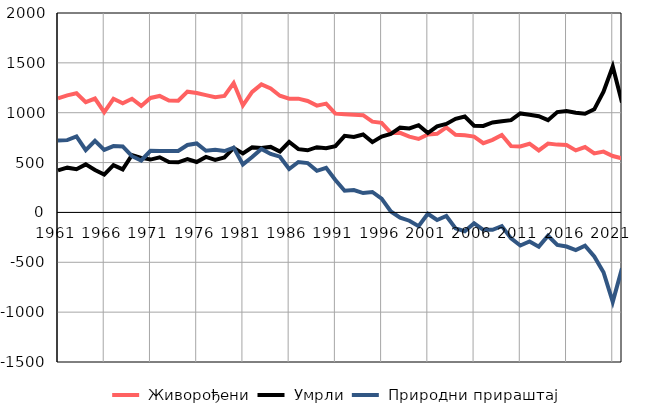
| Category |  Живорођени |  Умрли |  Природни прираштај |
|---|---|---|---|
| 1961.0 | 1144 | 422 | 722 |
| 1962.0 | 1174 | 449 | 725 |
| 1963.0 | 1195 | 433 | 762 |
| 1964.0 | 1106 | 482 | 624 |
| 1965.0 | 1142 | 425 | 717 |
| 1966.0 | 1006 | 379 | 627 |
| 1967.0 | 1140 | 475 | 665 |
| 1968.0 | 1094 | 432 | 662 |
| 1969.0 | 1140 | 576 | 564 |
| 1970.0 | 1068 | 547 | 521 |
| 1971.0 | 1148 | 530 | 618 |
| 1972.0 | 1168 | 553 | 615 |
| 1973.0 | 1122 | 506 | 616 |
| 1974.0 | 1120 | 503 | 617 |
| 1975.0 | 1211 | 535 | 676 |
| 1976.0 | 1198 | 506 | 692 |
| 1977.0 | 1176 | 557 | 619 |
| 1978.0 | 1156 | 527 | 629 |
| 1979.0 | 1168 | 552 | 616 |
| 1980.0 | 1297 | 647 | 650 |
| 1981.0 | 1073 | 591 | 482 |
| 1982.0 | 1208 | 653 | 555 |
| 1983.0 | 1284 | 647 | 637 |
| 1984.0 | 1243 | 657 | 586 |
| 1985.0 | 1170 | 611 | 559 |
| 1986.0 | 1141 | 706 | 435 |
| 1987.0 | 1141 | 635 | 506 |
| 1988.0 | 1118 | 623 | 495 |
| 1989.0 | 1071 | 654 | 417 |
| 1990.0 | 1091 | 643 | 448 |
| 1991.0 | 991 | 665 | 326 |
| 1992.0 | 985 | 768 | 217 |
| 1993.0 | 980 | 756 | 224 |
| 1994.0 | 975 | 781 | 194 |
| 1995.0 | 910 | 705 | 205 |
| 1996.0 | 898 | 760 | 138 |
| 1997.0 | 797 | 787 | 10 |
| 1998.0 | 798 | 850 | -52 |
| 1999.0 | 760 | 843 | -83 |
| 2000.0 | 737 | 875 | -138 |
| 2001.0 | 782 | 796 | -14 |
| 2002.0 | 788 | 864 | -76 |
| 2003.0 | 852 | 888 | -36 |
| 2004.0 | 779 | 939 | -160 |
| 2005.0 | 773 | 962 | -189 |
| 2006.0 | 761 | 870 | -109 |
| 2007.0 | 694 | 868 | -174 |
| 2008.0 | 728 | 902 | -174 |
| 2009.0 | 777 | 914 | -137 |
| 2010.0 | 665 | 925 | -260 |
| 2011.0 | 661 | 993 | -332 |
| 2012.0 | 689 | 980 | -291 |
| 2013.0 | 622 | 965 | -343 |
| 2014.0 | 691 | 925 | -234 |
| 2015.0 | 680 | 1006 | -326 |
| 2016.0 | 676 | 1018 | -342 |
| 2017.0 | 622 | 1000 | -378 |
| 2018.0 | 656 | 989 | -333 |
| 2019.0 | 592 | 1034 | -442 |
| 2020.0 | 610 | 1210 | -600 |
| 2021.0 | 566 | 1463 | -897 |
| 2022.0 | 542 | 1103 | -561 |